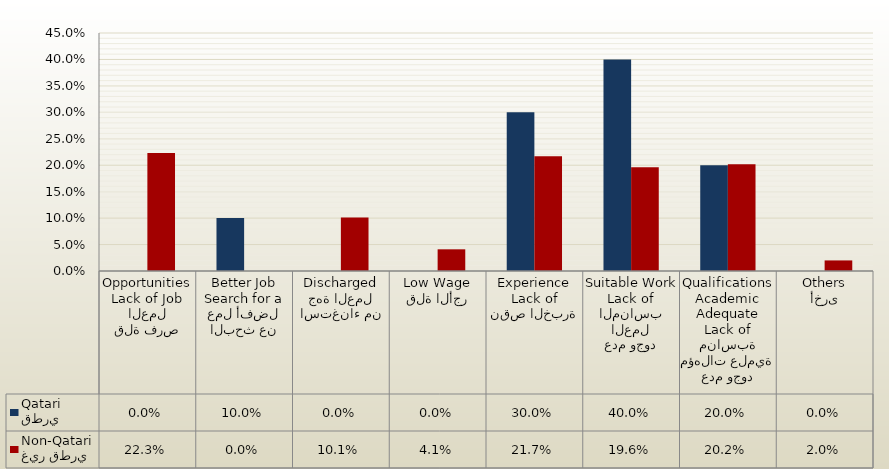
| Category | قطري
Qatari | غير قطري
Non-Qatari |
|---|---|---|
| قلة فرص العمل
Lack of Job Opportunities | 0 | 0.223 |
| البحث عن عمل أفضل
Search for a Better Job | 0.1 | 0 |
| استغناء من جهة العمل
Discharged | 0 | 0.101 |
| قلة الأجر
Low Wage | 0 | 0.041 |
| نقص الخبرة
Lack of Experience | 0.3 | 0.217 |
| عدم وجود العمل المناسب
Lack of Suitable Work | 0.4 | 0.196 |
| عدم وجود مؤهلات علمية مناسبة
Lack of Adequate Academic Qualifications | 0.2 | 0.202 |
| أخرى
Others | 0 | 0.02 |